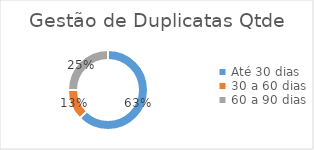
| Category | Series 0 |
|---|---|
| Até 30 dias | 5 |
| 30 a 60 dias | 1 |
| 60 a 90 dias | 2 |